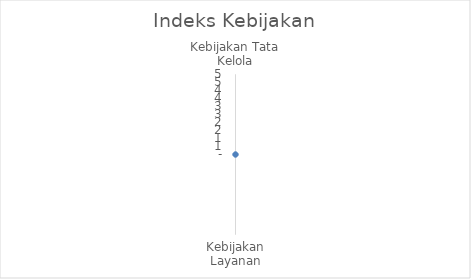
| Category | Indeks |
|---|---|
| Kebijakan Tata Kelola | 0 |
| Kebijakan Layanan | 0 |